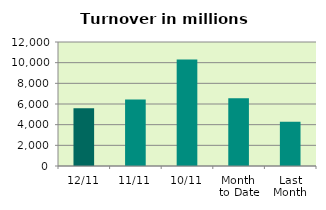
| Category | Series 0 |
|---|---|
| 12/11 | 5579.996 |
| 11/11 | 6427.383 |
| 10/11 | 10300.008 |
| Month 
to Date | 6546.168 |
| Last
Month | 4277.774 |